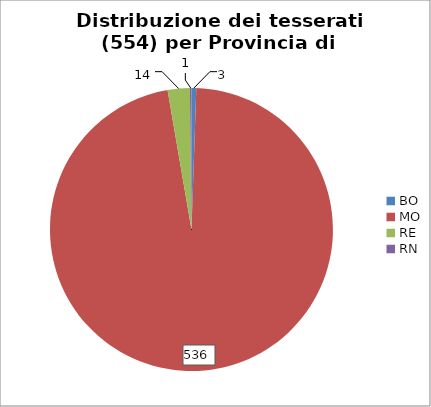
| Category | Nr. Tesserati |
|---|---|
| BO | 3 |
| MO | 536 |
| RE | 14 |
| RN | 1 |